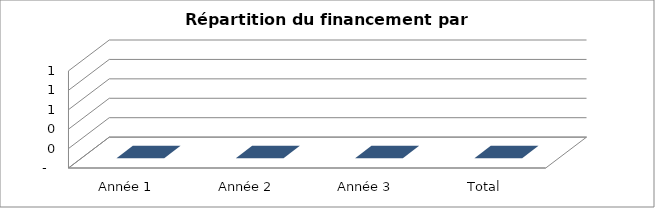
| Category | Total |
|---|---|
| Année 1 | 0 |
| Année 2 | 0 |
| Année 3 | 0 |
| Total | 0 |